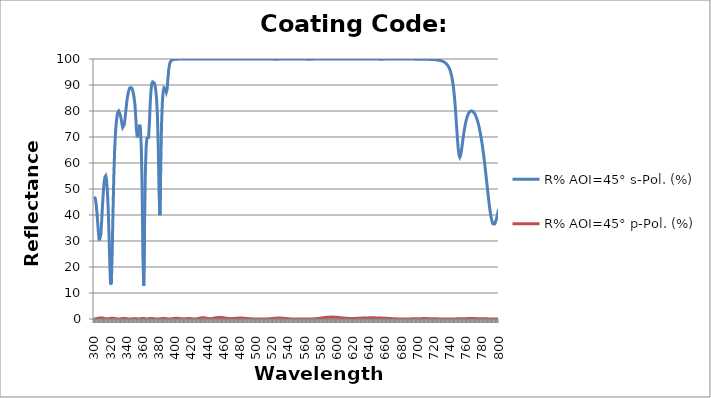
| Category | R% AOI=45° s-Pol. (%) | R% AOI=45° p-Pol. (%) |
|---|---|---|
| 300.0 | 47.018 | 0.069 |
| 301.0 | 46.516 | 0.074 |
| 302.0 | 44.592 | 0.107 |
| 303.0 | 41.383 | 0.164 |
| 304.0 | 37.283 | 0.234 |
| 305.0 | 33.132 | 0.308 |
| 306.0 | 30.251 | 0.37 |
| 307.0 | 29.977 | 0.413 |
| 308.0 | 32.771 | 0.426 |
| 309.0 | 37.794 | 0.409 |
| 310.0 | 43.529 | 0.363 |
| 311.0 | 48.678 | 0.297 |
| 312.0 | 52.505 | 0.222 |
| 313.0 | 54.691 | 0.15 |
| 314.0 | 55.077 | 0.094 |
| 315.0 | 53.477 | 0.064 |
| 316.0 | 49.572 | 0.062 |
| 317.0 | 42.932 | 0.088 |
| 318.0 | 33.352 | 0.135 |
| 319.0 | 21.977 | 0.193 |
| 320.0 | 13.248 | 0.249 |
| 321.0 | 13.96 | 0.292 |
| 322.0 | 25.448 | 0.312 |
| 323.0 | 41.041 | 0.306 |
| 324.0 | 54.636 | 0.274 |
| 325.0 | 64.507 | 0.222 |
| 326.0 | 71.152 | 0.158 |
| 327.0 | 75.449 | 0.095 |
| 328.0 | 78.087 | 0.043 |
| 329.0 | 79.508 | 0.011 |
| 330.0 | 79.973 | 0.002 |
| 331.0 | 79.63 | 0.018 |
| 332.0 | 78.58 | 0.053 |
| 333.0 | 76.973 | 0.099 |
| 334.0 | 75.14 | 0.145 |
| 335.0 | 73.705 | 0.183 |
| 336.0 | 73.454 | 0.204 |
| 337.0 | 74.817 | 0.206 |
| 338.0 | 77.444 | 0.187 |
| 339.0 | 80.506 | 0.152 |
| 340.0 | 83.319 | 0.108 |
| 341.0 | 85.573 | 0.064 |
| 342.0 | 87.22 | 0.028 |
| 343.0 | 88.317 | 0.006 |
| 344.0 | 88.936 | 0.002 |
| 345.0 | 89.126 | 0.016 |
| 346.0 | 88.902 | 0.043 |
| 347.0 | 88.243 | 0.078 |
| 348.0 | 87.09 | 0.113 |
| 349.0 | 85.356 | 0.14 |
| 350.0 | 82.948 | 0.154 |
| 351.0 | 78.458 | 0.147 |
| 352.0 | 72.906 | 0.111 |
| 353.0 | 69.863 | 0.059 |
| 354.0 | 71.045 | 0.015 |
| 355.0 | 73.636 | 0.001 |
| 356.0 | 74.713 | 0.025 |
| 357.0 | 72.784 | 0.083 |
| 358.0 | 66.067 | 0.154 |
| 359.0 | 50.825 | 0.211 |
| 360.0 | 24.722 | 0.233 |
| 361.0 | 12.762 | 0.21 |
| 362.0 | 35.248 | 0.151 |
| 363.0 | 56.194 | 0.079 |
| 364.0 | 66.252 | 0.021 |
| 365.0 | 69.542 | 0 |
| 366.0 | 69.4 | 0.024 |
| 367.0 | 69.906 | 0.085 |
| 368.0 | 75.195 | 0.159 |
| 369.0 | 82.638 | 0.217 |
| 370.0 | 87.915 | 0.238 |
| 371.0 | 90.6 | 0.212 |
| 372.0 | 91.21 | 0.175 |
| 373.0 | 91.253 | 0.134 |
| 374.0 | 90.809 | 0.091 |
| 375.0 | 89.748 | 0.052 |
| 376.0 | 87.767 | 0.022 |
| 377.0 | 84.239 | 0.004 |
| 378.0 | 77.877 | 0 |
| 379.0 | 66.391 | 0.011 |
| 380.0 | 48.943 | 0.034 |
| 381.0 | 39.897 | 0.072 |
| 382.0 | 57.656 | 0.117 |
| 383.0 | 74.385 | 0.159 |
| 384.0 | 83.02 | 0.191 |
| 385.0 | 87.131 | 0.207 |
| 386.0 | 88.896 | 0.205 |
| 387.0 | 89.196 | 0.186 |
| 388.0 | 88.399 | 0.152 |
| 389.0 | 87.285 | 0.111 |
| 390.0 | 88.397 | 0.069 |
| 391.0 | 92.586 | 0.032 |
| 392.0 | 96.165 | 0.008 |
| 393.0 | 98.034 | 0.001 |
| 394.0 | 98.925 | 0.011 |
| 395.0 | 99.366 | 0.038 |
| 396.0 | 99.601 | 0.077 |
| 397.0 | 99.734 | 0.124 |
| 398.0 | 99.814 | 0.17 |
| 399.0 | 99.864 | 0.211 |
| 400.0 | 99.897 | 0.24 |
| 401.0 | 99.919 | 0.254 |
| 402.0 | 99.934 | 0.255 |
| 403.0 | 99.945 | 0.244 |
| 404.0 | 99.953 | 0.221 |
| 405.0 | 99.959 | 0.19 |
| 406.0 | 99.964 | 0.156 |
| 407.0 | 99.967 | 0.119 |
| 408.0 | 99.971 | 0.08 |
| 409.0 | 99.974 | 0.053 |
| 410.0 | 99.976 | 0.041 |
| 411.0 | 99.977 | 0.045 |
| 412.0 | 99.978 | 0.062 |
| 413.0 | 99.978 | 0.09 |
| 414.0 | 99.977 | 0.122 |
| 415.0 | 99.976 | 0.151 |
| 416.0 | 99.975 | 0.172 |
| 417.0 | 99.973 | 0.18 |
| 418.0 | 99.971 | 0.174 |
| 419.0 | 99.968 | 0.154 |
| 420.0 | 99.964 | 0.124 |
| 421.0 | 99.961 | 0.088 |
| 422.0 | 99.959 | 0.053 |
| 423.0 | 99.958 | 0.025 |
| 424.0 | 99.959 | 0.01 |
| 425.0 | 99.961 | 0.014 |
| 426.0 | 99.965 | 0.038 |
| 427.0 | 99.968 | 0.083 |
| 428.0 | 99.971 | 0.145 |
| 429.0 | 99.974 | 0.218 |
| 430.0 | 99.976 | 0.295 |
| 431.0 | 99.978 | 0.367 |
| 432.0 | 99.979 | 0.427 |
| 433.0 | 99.979 | 0.469 |
| 434.0 | 99.98 | 0.487 |
| 435.0 | 99.979 | 0.482 |
| 436.0 | 99.979 | 0.454 |
| 437.0 | 99.978 | 0.407 |
| 438.0 | 99.976 | 0.347 |
| 439.0 | 99.975 | 0.282 |
| 440.0 | 99.973 | 0.221 |
| 441.0 | 99.972 | 0.169 |
| 442.0 | 99.97 | 0.134 |
| 443.0 | 99.97 | 0.118 |
| 444.0 | 99.97 | 0.125 |
| 445.0 | 99.971 | 0.155 |
| 446.0 | 99.972 | 0.201 |
| 447.0 | 99.973 | 0.259 |
| 448.0 | 99.974 | 0.323 |
| 449.0 | 99.976 | 0.39 |
| 450.0 | 99.977 | 0.455 |
| 451.0 | 99.978 | 0.512 |
| 452.0 | 99.979 | 0.558 |
| 453.0 | 99.98 | 0.59 |
| 454.0 | 99.98 | 0.604 |
| 455.0 | 99.98 | 0.602 |
| 456.0 | 99.98 | 0.596 |
| 457.0 | 99.98 | 0.579 |
| 458.0 | 99.98 | 0.55 |
| 459.0 | 99.979 | 0.511 |
| 460.0 | 99.978 | 0.465 |
| 461.0 | 99.977 | 0.413 |
| 462.0 | 99.976 | 0.36 |
| 463.0 | 99.975 | 0.309 |
| 464.0 | 99.974 | 0.261 |
| 465.0 | 99.972 | 0.22 |
| 466.0 | 99.971 | 0.187 |
| 467.0 | 99.969 | 0.163 |
| 468.0 | 99.968 | 0.149 |
| 469.0 | 99.967 | 0.146 |
| 470.0 | 99.967 | 0.151 |
| 471.0 | 99.967 | 0.165 |
| 472.0 | 99.967 | 0.185 |
| 473.0 | 99.968 | 0.21 |
| 474.0 | 99.968 | 0.237 |
| 475.0 | 99.969 | 0.265 |
| 476.0 | 99.97 | 0.291 |
| 477.0 | 99.971 | 0.315 |
| 478.0 | 99.972 | 0.334 |
| 479.0 | 99.972 | 0.347 |
| 480.0 | 99.973 | 0.353 |
| 481.0 | 99.973 | 0.353 |
| 482.0 | 99.973 | 0.347 |
| 483.0 | 99.973 | 0.334 |
| 484.0 | 99.973 | 0.316 |
| 485.0 | 99.972 | 0.293 |
| 486.0 | 99.972 | 0.267 |
| 487.0 | 99.971 | 0.239 |
| 488.0 | 99.97 | 0.21 |
| 489.0 | 99.968 | 0.181 |
| 490.0 | 99.967 | 0.154 |
| 491.0 | 99.965 | 0.129 |
| 492.0 | 99.963 | 0.106 |
| 493.0 | 99.961 | 0.086 |
| 494.0 | 99.959 | 0.07 |
| 495.0 | 99.957 | 0.056 |
| 496.0 | 99.956 | 0.046 |
| 497.0 | 99.955 | 0.039 |
| 498.0 | 99.954 | 0.036 |
| 499.0 | 99.955 | 0.034 |
| 500.0 | 99.956 | 0.033 |
| 501.0 | 99.957 | 0.032 |
| 502.0 | 99.958 | 0.031 |
| 503.0 | 99.96 | 0.03 |
| 504.0 | 99.962 | 0.027 |
| 505.0 | 99.963 | 0.023 |
| 506.0 | 99.965 | 0.018 |
| 507.0 | 99.966 | 0.014 |
| 508.0 | 99.967 | 0.009 |
| 509.0 | 99.967 | 0.006 |
| 510.0 | 99.968 | 0.005 |
| 511.0 | 99.968 | 0.006 |
| 512.0 | 99.967 | 0.01 |
| 513.0 | 99.967 | 0.019 |
| 514.0 | 99.966 | 0.031 |
| 515.0 | 99.964 | 0.048 |
| 516.0 | 99.963 | 0.069 |
| 517.0 | 99.961 | 0.094 |
| 518.0 | 99.958 | 0.122 |
| 519.0 | 99.956 | 0.153 |
| 520.0 | 99.953 | 0.185 |
| 521.0 | 99.95 | 0.218 |
| 522.0 | 99.947 | 0.249 |
| 523.0 | 99.945 | 0.279 |
| 524.0 | 99.944 | 0.306 |
| 525.0 | 99.943 | 0.328 |
| 526.0 | 99.944 | 0.346 |
| 527.0 | 99.946 | 0.358 |
| 528.0 | 99.949 | 0.364 |
| 529.0 | 99.952 | 0.364 |
| 530.0 | 99.956 | 0.358 |
| 531.0 | 99.96 | 0.345 |
| 532.0 | 99.963 | 0.328 |
| 533.0 | 99.966 | 0.306 |
| 534.0 | 99.969 | 0.282 |
| 535.0 | 99.971 | 0.254 |
| 536.0 | 99.973 | 0.224 |
| 537.0 | 99.975 | 0.194 |
| 538.0 | 99.976 | 0.163 |
| 539.0 | 99.978 | 0.134 |
| 540.0 | 99.978 | 0.106 |
| 541.0 | 99.979 | 0.081 |
| 542.0 | 99.98 | 0.059 |
| 543.0 | 99.98 | 0.041 |
| 544.0 | 99.98 | 0.026 |
| 545.0 | 99.98 | 0.015 |
| 546.0 | 99.98 | 0.008 |
| 547.0 | 99.98 | 0.004 |
| 548.0 | 99.979 | 0.003 |
| 549.0 | 99.979 | 0.004 |
| 550.0 | 99.978 | 0.007 |
| 551.0 | 99.977 | 0.012 |
| 552.0 | 99.975 | 0.017 |
| 553.0 | 99.974 | 0.022 |
| 554.0 | 99.972 | 0.027 |
| 555.0 | 99.97 | 0.03 |
| 556.0 | 99.968 | 0.033 |
| 557.0 | 99.965 | 0.034 |
| 558.0 | 99.962 | 0.034 |
| 559.0 | 99.959 | 0.032 |
| 560.0 | 99.955 | 0.03 |
| 561.0 | 99.952 | 0.026 |
| 562.0 | 99.949 | 0.022 |
| 563.0 | 99.947 | 0.018 |
| 564.0 | 99.945 | 0.014 |
| 565.0 | 99.944 | 0.012 |
| 566.0 | 99.944 | 0.01 |
| 567.0 | 99.945 | 0.011 |
| 568.0 | 99.946 | 0.015 |
| 569.0 | 99.948 | 0.022 |
| 570.0 | 99.95 | 0.032 |
| 571.0 | 99.953 | 0.046 |
| 572.0 | 99.955 | 0.064 |
| 573.0 | 99.958 | 0.086 |
| 574.0 | 99.96 | 0.112 |
| 575.0 | 99.962 | 0.141 |
| 576.0 | 99.964 | 0.175 |
| 577.0 | 99.965 | 0.211 |
| 578.0 | 99.966 | 0.25 |
| 579.0 | 99.968 | 0.292 |
| 580.0 | 99.968 | 0.334 |
| 581.0 | 99.969 | 0.378 |
| 582.0 | 99.97 | 0.422 |
| 583.0 | 99.97 | 0.464 |
| 584.0 | 99.97 | 0.506 |
| 585.0 | 99.97 | 0.546 |
| 586.0 | 99.97 | 0.583 |
| 587.0 | 99.97 | 0.616 |
| 588.0 | 99.97 | 0.646 |
| 589.0 | 99.969 | 0.672 |
| 590.0 | 99.968 | 0.692 |
| 591.0 | 99.968 | 0.708 |
| 592.0 | 99.967 | 0.719 |
| 593.0 | 99.966 | 0.724 |
| 594.0 | 99.965 | 0.725 |
| 595.0 | 99.964 | 0.72 |
| 596.0 | 99.963 | 0.71 |
| 597.0 | 99.962 | 0.696 |
| 598.0 | 99.961 | 0.678 |
| 599.0 | 99.96 | 0.655 |
| 600.0 | 99.959 | 0.63 |
| 601.0 | 99.958 | 0.602 |
| 602.0 | 99.958 | 0.571 |
| 603.0 | 99.957 | 0.539 |
| 604.0 | 99.957 | 0.506 |
| 605.0 | 99.957 | 0.473 |
| 606.0 | 99.958 | 0.44 |
| 607.0 | 99.958 | 0.407 |
| 608.0 | 99.959 | 0.376 |
| 609.0 | 99.96 | 0.346 |
| 610.0 | 99.961 | 0.319 |
| 611.0 | 99.962 | 0.294 |
| 612.0 | 99.963 | 0.272 |
| 613.0 | 99.964 | 0.252 |
| 614.0 | 99.965 | 0.236 |
| 615.0 | 99.966 | 0.223 |
| 616.0 | 99.967 | 0.213 |
| 617.0 | 99.968 | 0.206 |
| 618.0 | 99.968 | 0.203 |
| 619.0 | 99.969 | 0.202 |
| 620.0 | 99.97 | 0.205 |
| 621.0 | 99.97 | 0.21 |
| 622.0 | 99.97 | 0.217 |
| 623.0 | 99.971 | 0.226 |
| 624.0 | 99.971 | 0.238 |
| 625.0 | 99.971 | 0.25 |
| 626.0 | 99.971 | 0.264 |
| 627.0 | 99.971 | 0.279 |
| 628.0 | 99.971 | 0.295 |
| 629.0 | 99.971 | 0.311 |
| 630.0 | 99.971 | 0.327 |
| 631.0 | 99.97 | 0.342 |
| 632.0 | 99.97 | 0.358 |
| 633.0 | 99.969 | 0.372 |
| 634.0 | 99.969 | 0.385 |
| 635.0 | 99.968 | 0.397 |
| 636.0 | 99.967 | 0.408 |
| 637.0 | 99.966 | 0.418 |
| 638.0 | 99.965 | 0.426 |
| 639.0 | 99.964 | 0.433 |
| 640.0 | 99.963 | 0.438 |
| 641.0 | 99.962 | 0.442 |
| 642.0 | 99.961 | 0.444 |
| 643.0 | 99.959 | 0.444 |
| 644.0 | 99.958 | 0.444 |
| 645.0 | 99.957 | 0.443 |
| 646.0 | 99.956 | 0.441 |
| 647.0 | 99.955 | 0.437 |
| 648.0 | 99.954 | 0.431 |
| 649.0 | 99.953 | 0.424 |
| 650.0 | 99.952 | 0.416 |
| 651.0 | 99.951 | 0.407 |
| 652.0 | 99.951 | 0.396 |
| 653.0 | 99.95 | 0.385 |
| 654.0 | 99.95 | 0.372 |
| 655.0 | 99.95 | 0.358 |
| 656.0 | 99.95 | 0.344 |
| 657.0 | 99.951 | 0.329 |
| 658.0 | 99.951 | 0.313 |
| 659.0 | 99.952 | 0.296 |
| 660.0 | 99.952 | 0.279 |
| 661.0 | 99.953 | 0.262 |
| 662.0 | 99.954 | 0.244 |
| 663.0 | 99.955 | 0.226 |
| 664.0 | 99.956 | 0.209 |
| 665.0 | 99.957 | 0.191 |
| 666.0 | 99.958 | 0.174 |
| 667.0 | 99.958 | 0.157 |
| 668.0 | 99.959 | 0.14 |
| 669.0 | 99.96 | 0.124 |
| 670.0 | 99.961 | 0.109 |
| 671.0 | 99.961 | 0.094 |
| 672.0 | 99.962 | 0.08 |
| 673.0 | 99.962 | 0.068 |
| 674.0 | 99.963 | 0.056 |
| 675.0 | 99.963 | 0.045 |
| 676.0 | 99.963 | 0.036 |
| 677.0 | 99.964 | 0.028 |
| 678.0 | 99.964 | 0.021 |
| 679.0 | 99.964 | 0.015 |
| 680.0 | 99.964 | 0.011 |
| 681.0 | 99.964 | 0.008 |
| 682.0 | 99.964 | 0.006 |
| 683.0 | 99.963 | 0.006 |
| 684.0 | 99.963 | 0.006 |
| 685.0 | 99.962 | 0.008 |
| 686.0 | 99.962 | 0.012 |
| 687.0 | 99.961 | 0.016 |
| 688.0 | 99.961 | 0.021 |
| 689.0 | 99.96 | 0.027 |
| 690.0 | 99.959 | 0.034 |
| 691.0 | 99.958 | 0.041 |
| 692.0 | 99.957 | 0.049 |
| 693.0 | 99.956 | 0.058 |
| 694.0 | 99.954 | 0.066 |
| 695.0 | 99.953 | 0.075 |
| 696.0 | 99.951 | 0.084 |
| 697.0 | 99.949 | 0.092 |
| 698.0 | 99.947 | 0.101 |
| 699.0 | 99.945 | 0.109 |
| 700.0 | 99.942 | 0.116 |
| 701.0 | 99.939 | 0.123 |
| 702.0 | 99.936 | 0.13 |
| 703.0 | 99.933 | 0.135 |
| 704.0 | 99.929 | 0.14 |
| 705.0 | 99.925 | 0.144 |
| 706.0 | 99.92 | 0.147 |
| 707.0 | 99.915 | 0.148 |
| 708.0 | 99.909 | 0.149 |
| 709.0 | 99.903 | 0.149 |
| 710.0 | 99.896 | 0.148 |
| 711.0 | 99.888 | 0.146 |
| 712.0 | 99.879 | 0.143 |
| 713.0 | 99.87 | 0.139 |
| 714.0 | 99.859 | 0.134 |
| 715.0 | 99.846 | 0.129 |
| 716.0 | 99.832 | 0.122 |
| 717.0 | 99.817 | 0.115 |
| 718.0 | 99.799 | 0.108 |
| 719.0 | 99.778 | 0.1 |
| 720.0 | 99.755 | 0.092 |
| 721.0 | 99.729 | 0.084 |
| 722.0 | 99.7 | 0.075 |
| 723.0 | 99.666 | 0.067 |
| 724.0 | 99.626 | 0.058 |
| 725.0 | 99.581 | 0.05 |
| 726.0 | 99.528 | 0.043 |
| 727.0 | 99.466 | 0.035 |
| 728.0 | 99.393 | 0.028 |
| 729.0 | 99.307 | 0.022 |
| 730.0 | 99.205 | 0.017 |
| 731.0 | 99.083 | 0.012 |
| 732.0 | 98.937 | 0.008 |
| 733.0 | 98.761 | 0.004 |
| 734.0 | 98.547 | 0.002 |
| 735.0 | 98.286 | 0.001 |
| 736.0 | 97.965 | 0 |
| 737.0 | 97.567 | 0 |
| 738.0 | 97.069 | 0.002 |
| 739.0 | 96.441 | 0.004 |
| 740.0 | 95.644 | 0.006 |
| 741.0 | 94.624 | 0.01 |
| 742.0 | 93.313 | 0.014 |
| 743.0 | 91.623 | 0.02 |
| 744.0 | 89.446 | 0.025 |
| 745.0 | 86.671 | 0.032 |
| 746.0 | 83.205 | 0.039 |
| 747.0 | 79.047 | 0.046 |
| 748.0 | 74.385 | 0.053 |
| 749.0 | 69.693 | 0.061 |
| 750.0 | 65.693 | 0.069 |
| 751.0 | 63.095 | 0.077 |
| 752.0 | 62.24 | 0.086 |
| 753.0 | 62.947 | 0.094 |
| 754.0 | 64.706 | 0.101 |
| 755.0 | 66.967 | 0.109 |
| 756.0 | 69.322 | 0.116 |
| 757.0 | 71.532 | 0.123 |
| 758.0 | 73.484 | 0.13 |
| 759.0 | 75.143 | 0.135 |
| 760.0 | 76.516 | 0.14 |
| 761.0 | 77.623 | 0.145 |
| 762.0 | 78.492 | 0.149 |
| 763.0 | 79.148 | 0.152 |
| 764.0 | 79.615 | 0.155 |
| 765.0 | 79.911 | 0.156 |
| 766.0 | 80.049 | 0.157 |
| 767.0 | 80.041 | 0.157 |
| 768.0 | 79.893 | 0.157 |
| 769.0 | 79.609 | 0.155 |
| 770.0 | 79.19 | 0.153 |
| 771.0 | 78.636 | 0.15 |
| 772.0 | 77.942 | 0.147 |
| 773.0 | 77.104 | 0.142 |
| 774.0 | 76.116 | 0.138 |
| 775.0 | 74.967 | 0.132 |
| 776.0 | 73.651 | 0.126 |
| 777.0 | 72.157 | 0.12 |
| 778.0 | 70.477 | 0.114 |
| 779.0 | 68.604 | 0.106 |
| 780.0 | 66.534 | 0.099 |
| 781.0 | 64.267 | 0.092 |
| 782.0 | 61.813 | 0.084 |
| 783.0 | 59.189 | 0.077 |
| 784.0 | 56.425 | 0.069 |
| 785.0 | 53.568 | 0.062 |
| 786.0 | 50.677 | 0.055 |
| 787.0 | 47.83 | 0.048 |
| 788.0 | 45.117 | 0.041 |
| 789.0 | 42.633 | 0.035 |
| 790.0 | 40.472 | 0.029 |
| 791.0 | 38.719 | 0.024 |
| 792.0 | 37.433 | 0.019 |
| 793.0 | 36.648 | 0.014 |
| 794.0 | 36.363 | 0.011 |
| 795.0 | 36.55 | 0.007 |
| 796.0 | 37.152 | 0.005 |
| 797.0 | 38.098 | 0.003 |
| 798.0 | 39.31 | 0.001 |
| 799.0 | 40.709 | 0.001 |
| 800.0 | 42.221 | 0.001 |